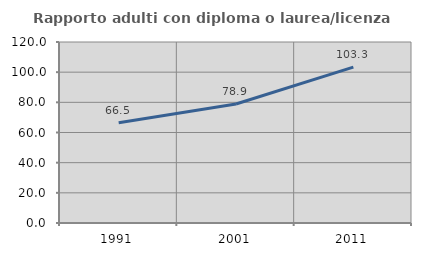
| Category | Rapporto adulti con diploma o laurea/licenza media  |
|---|---|
| 1991.0 | 66.471 |
| 2001.0 | 78.905 |
| 2011.0 | 103.304 |